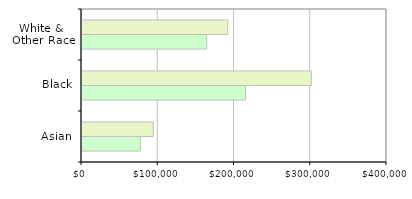
| Category | 2006 | 2010 |
|---|---|---|
| White & 
Other Race | 191160 | 163583 |
| Black | 300798 | 214455 |
| Asian | 93449 | 76441 |